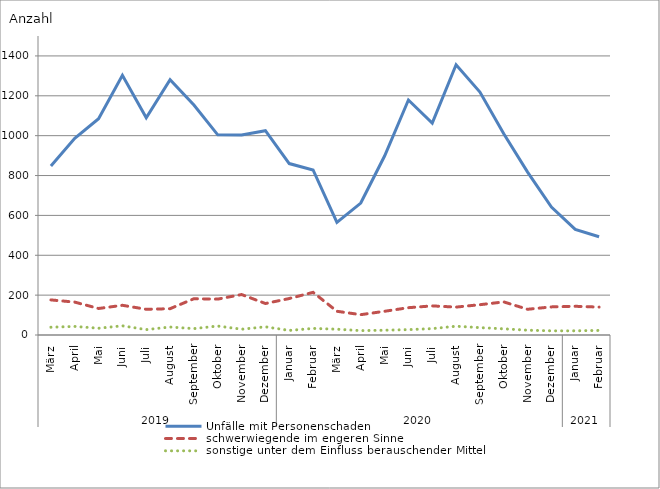
| Category | Unfälle mit Personenschaden | schwerwiegende im engeren Sinne | sonstige unter dem Einfluss berauschender Mittel |
|---|---|---|---|
| 0 | 848 | 176 | 39 |
| 1 | 987 | 165 | 43 |
| 2 | 1085 | 133 | 34 |
| 3 | 1303 | 149 | 46 |
| 4 | 1090 | 129 | 27 |
| 5 | 1281 | 132 | 40 |
| 6 | 1154 | 182 | 32 |
| 7 | 1004 | 180 | 45 |
| 8 | 1003 | 203 | 29 |
| 9 | 1025 | 158 | 41 |
| 10 | 860 | 183 | 23 |
| 11 | 828 | 214 | 33 |
| 12 | 565 | 119 | 29 |
| 13 | 662 | 102 | 22 |
| 14 | 898 | 119 | 24 |
| 15 | 1179 | 137 | 27 |
| 16 | 1063 | 146 | 32 |
| 17 | 1356 | 140 | 44 |
| 18 | 1219 | 152 | 37 |
| 19 | 1010 | 166 | 31 |
| 20 | 817 | 129 | 24 |
| 21 | 642 | 141 | 21 |
| 22 | 530 | 144 | 21 |
| 23 | 493 | 140 | 23 |